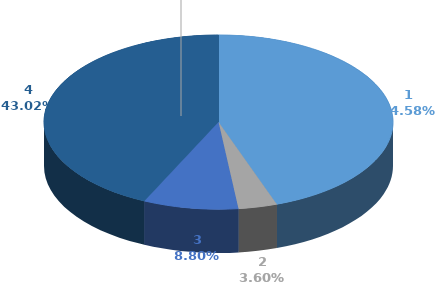
| Category | Series 0 | Series 1 |
|---|---|---|
| 0 | 1575109 |  |
| 1 | 127244 |  |
| 2 | 311024 |  |
| 3 | 1519969 |  |